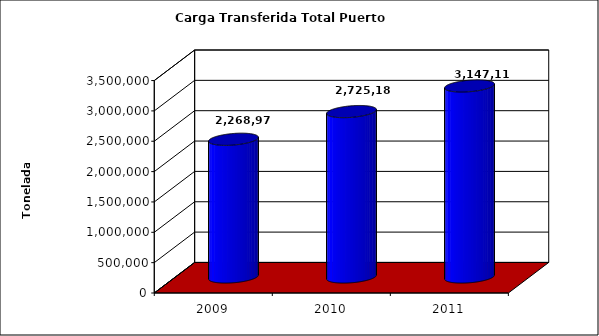
| Category | Series 0 |
|---|---|
| 2009.0 | 2268977.889 |
| 2010.0 | 2725187 |
| 2011.0 | 3147118.951 |